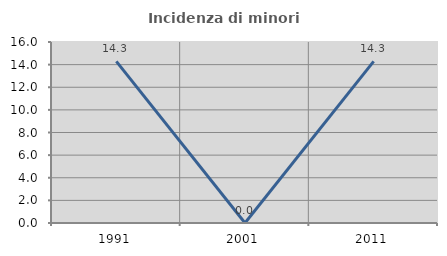
| Category | Incidenza di minori stranieri |
|---|---|
| 1991.0 | 14.286 |
| 2001.0 | 0 |
| 2011.0 | 14.286 |